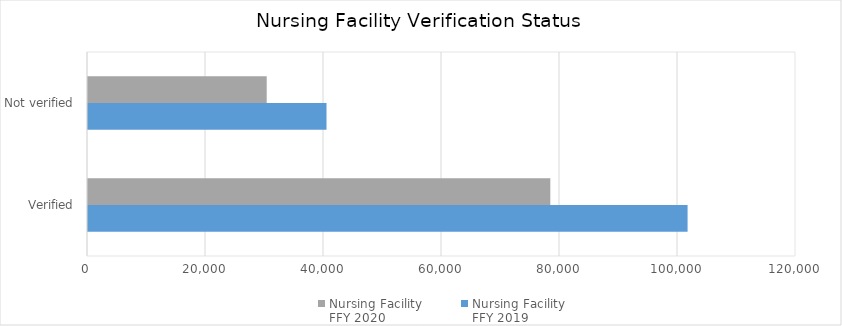
| Category | Nursing Facility 
FFY 2019 | Nursing Facility 
FFY 2020 |
|---|---|---|
| Verified | 101624 | 78358 |
| Not verified | 40427 | 30290 |